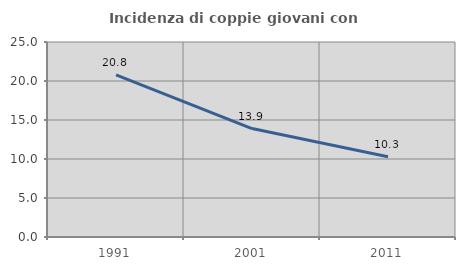
| Category | Incidenza di coppie giovani con figli |
|---|---|
| 1991.0 | 20.779 |
| 2001.0 | 13.906 |
| 2011.0 | 10.285 |